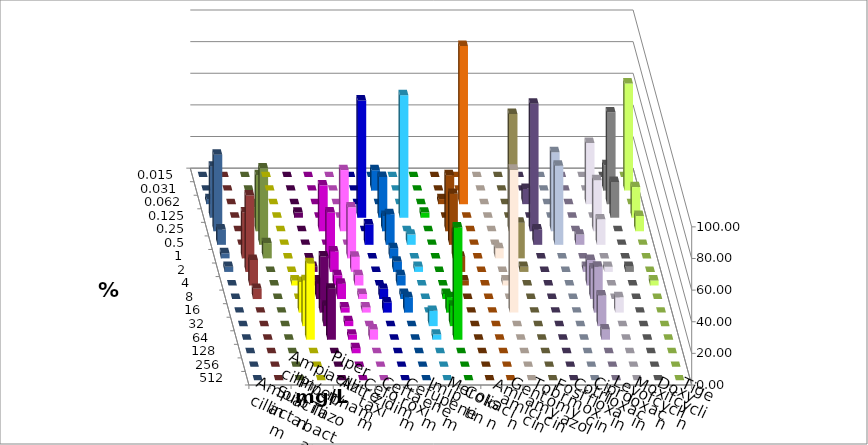
| Category | Ampicillin | Ampicillin/ Sulbactam | Piperacillin | Piperacillin/ Tazobactam | Aztreonam | Cefotaxim | Ceftazidim | Cefuroxim | Imipenem | Meropenem | Colistin | Amikacin | Gentamicin | Tobramycin | Fosfomycin | Cotrimoxazol | Ciprofloxacin | Levofloxacin | Moxifloxacin | Doxycyclin | Tigecyclin |
|---|---|---|---|---|---|---|---|---|---|---|---|---|---|---|---|---|---|---|---|---|---|
| 0.015 | 0 | 0 | 0 | 0 | 0 | 0 | 0 | 0 | 0 | 0 | 0 | 0 | 0 | 0 | 0 | 0 | 0 | 0 | 0 | 0 | 0 |
| 0.031 | 0 | 0 | 0 | 0 | 0 | 12.903 | 0 | 0 | 0 | 0 | 0 | 0 | 0 | 0 | 0 | 0 | 16.129 | 67.742 | 0 | 0 | 0 |
| 0.062 | 0 | 0 | 0 | 0 | 0 | 0 | 0 | 0 | 3.226 | 100 | 0 | 0 | 9.677 | 0 | 0 | 38.71 | 58.065 | 0 | 3.226 | 0 | 0 |
| 0.125 | 0 | 3.226 | 0 | 0 | 74.194 | 25.806 | 77.419 | 3.226 | 0 | 0 | 0 | 0 | 0 | 0 | 0 | 0 | 22.581 | 19.355 | 32.258 | 0 | 6.452 |
| 0.25 | 0 | 0 | 29.032 | 38.71 | 0 | 9.677 | 0 | 0 | 35.484 | 0 | 0 | 74.194 | 80.645 | 50 | 0 | 32.258 | 0 | 9.677 | 48.387 | 0 | 35.484 |
| 0.5 | 0 | 0 | 0 | 0 | 12.903 | 19.355 | 6.452 | 0 | 32.258 | 0 | 0 | 0 | 9.677 | 50 | 6.452 | 16.129 | 0 | 0 | 9.677 | 0 | 48.387 |
| 1.0 | 0 | 0 | 29.032 | 32.258 | 0 | 6.452 | 0 | 0 | 16.129 | 0 | 6.452 | 22.581 | 0 | 0 | 0 | 0 | 0 | 0 | 3.226 | 29.032 | 9.677 |
| 2.0 | 0 | 3.226 | 12.903 | 9.677 | 0 | 6.452 | 3.226 | 0 | 9.677 | 0 | 0 | 3.226 | 0 | 0 | 3.226 | 3.226 | 3.226 | 0 | 3.226 | 48.387 | 0 |
| 4.0 | 3.226 | 3.226 | 6.452 | 6.452 | 0 | 6.452 | 0 | 0 | 3.226 | 0 | 3.226 | 0 | 0 | 0 | 16.129 | 0 | 0 | 3.226 | 0 | 16.129 | 0 |
| 8.0 | 0 | 9.677 | 9.677 | 3.226 | 6.452 | 3.226 | 0 | 3.226 | 0 | 0 | 0 | 0 | 0 | 0 | 19.355 | 0 | 0 | 0 | 0 | 6.452 | 0 |
| 16.0 | 19.355 | 35.484 | 3.226 | 3.226 | 6.452 | 9.677 | 0 | 9.677 | 0 | 0 | 90.323 | 0 | 0 | 0 | 29.032 | 9.677 | 0 | 0 | 0 | 0 | 0 |
| 32.0 | 29.032 | 12.903 | 3.226 | 0 | 0 | 0 | 9.677 | 12.903 | 0 | 0 | 0 | 0 | 0 | 0 | 19.355 | 0 | 0 | 0 | 0 | 0 | 0 |
| 64.0 | 48.387 | 32.258 | 3.226 | 6.452 | 0 | 0 | 3.226 | 70.968 | 0 | 0 | 0 | 0 | 0 | 0 | 6.452 | 0 | 0 | 0 | 0 | 0 | 0 |
| 128.0 | 0 | 0 | 3.226 | 0 | 0 | 0 | 0 | 0 | 0 | 0 | 0 | 0 | 0 | 0 | 0 | 0 | 0 | 0 | 0 | 0 | 0 |
| 256.0 | 0 | 0 | 0 | 0 | 0 | 0 | 0 | 0 | 0 | 0 | 0 | 0 | 0 | 0 | 0 | 0 | 0 | 0 | 0 | 0 | 0 |
| 512.0 | 0 | 0 | 0 | 0 | 0 | 0 | 0 | 0 | 0 | 0 | 0 | 0 | 0 | 0 | 0 | 0 | 0 | 0 | 0 | 0 | 0 |